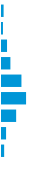
| Category | Series 0 |
|---|---|
| 0 | 0.02 |
| 1 | 0.012 |
| 2 | 0.063 |
| 3 | 0.105 |
| 4 | 0.243 |
| 5 | 0.301 |
| 6 | 0.177 |
| 7 | 0.051 |
| 8 | 0.027 |
| 9 | 0 |